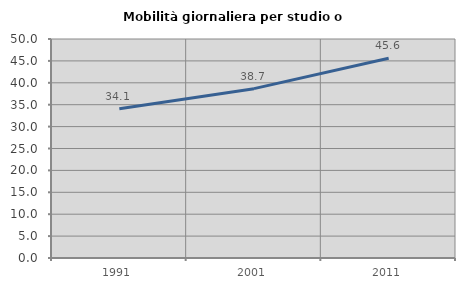
| Category | Mobilità giornaliera per studio o lavoro |
|---|---|
| 1991.0 | 34.097 |
| 2001.0 | 38.666 |
| 2011.0 | 45.59 |